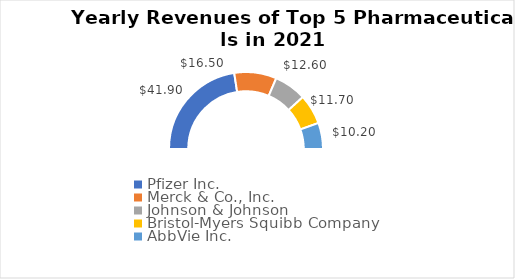
| Category | Series 0 |
|---|---|
| Pfizer Inc. | 41.9 |
| Merck & Co., Inc.  | 16.5 |
| Johnson & Johnson | 12.6 |
| Bristol-Myers Squibb Company  | 11.7 |
| AbbVie Inc.  | 10.2 |
| Total | 92.9 |